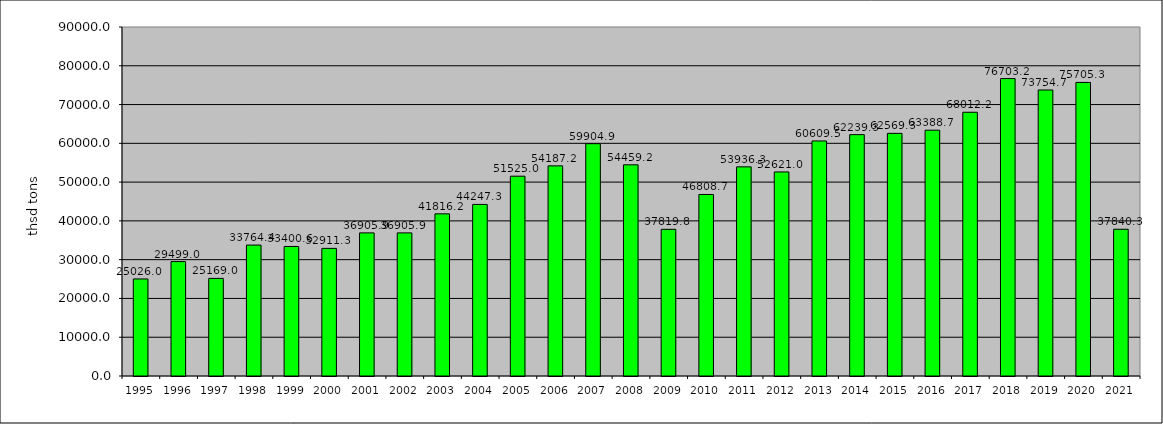
| Category | freigt transported (thou tons) |
|---|---|
| 1995.0 | 25026 |
| 1996.0 | 29499 |
| 1997.0 | 25169 |
| 1998.0 | 33764.4 |
| 1999.0 | 33400.6 |
| 2000.0 | 32911.3 |
| 2001.0 | 36905.9 |
| 2002.0 | 36905.9 |
| 2003.0 | 41816.2 |
| 2004.0 | 44247.3 |
| 2005.0 | 51525 |
| 2006.0 | 54187.2 |
| 2007.0 | 59904.9 |
| 2008.0 | 54459.2 |
| 2009.0 | 37819.8 |
| 2010.0 | 46808.7 |
| 2011.0 | 53936.3 |
| 2012.0 | 52621 |
| 2013.0 | 60609.5 |
| 2014.0 | 62239.3 |
| 2015.0 | 62569.3 |
| 2016.0 | 63388.7 |
| 2017.0 | 68012.2 |
| 2018.0 | 76703.2 |
| 2019.0 | 73754.7 |
| 2020.0 | 75705.3 |
| 2021.0 | 37840.3 |